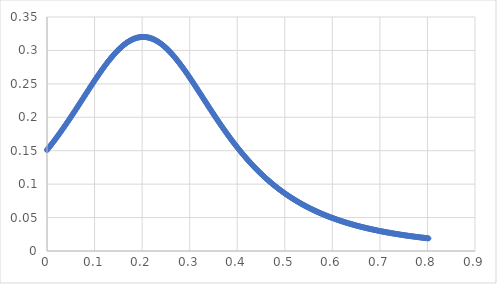
| Category | Series 0 |
|---|---|
| 2e-05 | 0.151 |
| 0.00202 | 0.153 |
| 0.004 | 0.155 |
| 0.00601 | 0.156 |
| 0.00803 | 0.158 |
| 0.01003 | 0.16 |
| 0.01201 | 0.162 |
| 0.01401 | 0.164 |
| 0.01602 | 0.166 |
| 0.01802 | 0.168 |
| 0.02 | 0.17 |
| 0.02201 | 0.171 |
| 0.02403 | 0.173 |
| 0.02603 | 0.175 |
| 0.02801 | 0.177 |
| 0.03001 | 0.179 |
| 0.03203 | 0.181 |
| 0.03404 | 0.183 |
| 0.03601 | 0.185 |
| 0.03801 | 0.188 |
| 0.04002 | 0.19 |
| 0.04203 | 0.192 |
| 0.044 | 0.194 |
| 0.046 | 0.196 |
| 0.04803 | 0.198 |
| 0.05004 | 0.2 |
| 0.05201 | 0.202 |
| 0.05401 | 0.204 |
| 0.05603 | 0.207 |
| 0.05804 | 0.209 |
| 0.06001 | 0.211 |
| 0.06201 | 0.213 |
| 0.06403 | 0.215 |
| 0.06603 | 0.218 |
| 0.068 | 0.22 |
| 0.07001 | 0.222 |
| 0.07203 | 0.224 |
| 0.07404 | 0.226 |
| 0.07601 | 0.229 |
| 0.07801 | 0.231 |
| 0.08003 | 0.233 |
| 0.08203 | 0.235 |
| 0.08401 | 0.237 |
| 0.08602 | 0.24 |
| 0.08803 | 0.242 |
| 0.09004 | 0.244 |
| 0.09201 | 0.246 |
| 0.09401 | 0.248 |
| 0.09603 | 0.25 |
| 0.09804 | 0.253 |
| 0.10002 | 0.255 |
| 0.10202 | 0.257 |
| 0.10403 | 0.259 |
| 0.10604 | 0.261 |
| 0.10802 | 0.263 |
| 0.11002 | 0.265 |
| 0.11203 | 0.267 |
| 0.11404 | 0.269 |
| 0.11601 | 0.271 |
| 0.11801 | 0.273 |
| 0.12003 | 0.275 |
| 0.12204 | 0.277 |
| 0.12402 | 0.279 |
| 0.12602 | 0.281 |
| 0.12804 | 0.283 |
| 0.13004 | 0.285 |
| 0.13202 | 0.286 |
| 0.13401 | 0.288 |
| 0.13603 | 0.29 |
| 0.13804 | 0.292 |
| 0.14001 | 0.293 |
| 0.14201 | 0.295 |
| 0.14402 | 0.296 |
| 0.14603 | 0.298 |
| 0.14801 | 0.299 |
| 0.15001 | 0.301 |
| 0.15203 | 0.302 |
| 0.15404 | 0.304 |
| 0.15602 | 0.305 |
| 0.15802 | 0.306 |
| 0.16004 | 0.307 |
| 0.16204 | 0.308 |
| 0.16401 | 0.31 |
| 0.16601 | 0.311 |
| 0.16802 | 0.312 |
| 0.17003 | 0.313 |
| 0.17201 | 0.313 |
| 0.17401 | 0.314 |
| 0.17603 | 0.315 |
| 0.17804 | 0.316 |
| 0.18002 | 0.317 |
| 0.18201 | 0.317 |
| 0.18403 | 0.318 |
| 0.18604 | 0.318 |
| 0.18802 | 0.319 |
| 0.19001 | 0.319 |
| 0.19202 | 0.319 |
| 0.19403 | 0.32 |
| 0.19601 | 0.32 |
| 0.198 | 0.32 |
| 0.20002 | 0.32 |
| 0.20204 | 0.32 |
| 0.20402 | 0.32 |
| 0.20601 | 0.32 |
| 0.20803 | 0.32 |
| 0.21004 | 0.32 |
| 0.21202 | 0.319 |
| 0.214 | 0.319 |
| 0.21602 | 0.319 |
| 0.21802 | 0.318 |
| 0.22 | 0.318 |
| 0.222 | 0.317 |
| 0.22402 | 0.317 |
| 0.22603 | 0.316 |
| 0.22801 | 0.315 |
| 0.23001 | 0.314 |
| 0.23202 | 0.314 |
| 0.23404 | 0.313 |
| 0.23602 | 0.312 |
| 0.23801 | 0.311 |
| 0.24002 | 0.31 |
| 0.24203 | 0.309 |
| 0.24401 | 0.308 |
| 0.246 | 0.306 |
| 0.24802 | 0.305 |
| 0.25003 | 0.304 |
| 0.25202 | 0.302 |
| 0.254 | 0.301 |
| 0.25602 | 0.3 |
| 0.25803 | 0.298 |
| 0.26001 | 0.297 |
| 0.262 | 0.295 |
| 0.26402 | 0.294 |
| 0.26603 | 0.292 |
| 0.26801 | 0.29 |
| 0.27 | 0.289 |
| 0.27202 | 0.287 |
| 0.27403 | 0.285 |
| 0.27601 | 0.283 |
| 0.27801 | 0.281 |
| 0.28002 | 0.279 |
| 0.28203 | 0.278 |
| 0.28401 | 0.276 |
| 0.286 | 0.274 |
| 0.28802 | 0.272 |
| 0.29003 | 0.27 |
| 0.29202 | 0.268 |
| 0.294 | 0.266 |
| 0.29602 | 0.264 |
| 0.29803 | 0.262 |
| 0.30001 | 0.259 |
| 0.302 | 0.257 |
| 0.30402 | 0.255 |
| 0.30603 | 0.253 |
| 0.30802 | 0.251 |
| 0.31 | 0.249 |
| 0.31202 | 0.247 |
| 0.31403 | 0.244 |
| 0.31601 | 0.242 |
| 0.318 | 0.24 |
| 0.32002 | 0.238 |
| 0.32202 | 0.236 |
| 0.32401 | 0.233 |
| 0.326 | 0.231 |
| 0.32802 | 0.229 |
| 0.33004 | 0.227 |
| 0.33201 | 0.225 |
| 0.334 | 0.222 |
| 0.33602 | 0.22 |
| 0.33803 | 0.218 |
| 0.34001 | 0.216 |
| 0.34201 | 0.214 |
| 0.34402 | 0.211 |
| 0.34602 | 0.209 |
| 0.34801 | 0.207 |
| 0.34999 | 0.205 |
| 0.35202 | 0.203 |
| 0.35403 | 0.201 |
| 0.35603 | 0.198 |
| 0.358 | 0.196 |
| 0.36002 | 0.194 |
| 0.36203 | 0.192 |
| 0.36402 | 0.19 |
| 0.366 | 0.188 |
| 0.36801 | 0.186 |
| 0.37003 | 0.184 |
| 0.37202 | 0.182 |
| 0.37399 | 0.18 |
| 0.37601 | 0.178 |
| 0.37803 | 0.176 |
| 0.38002 | 0.174 |
| 0.382 | 0.172 |
| 0.38402 | 0.17 |
| 0.38603 | 0.168 |
| 0.388 | 0.166 |
| 0.38999 | 0.164 |
| 0.39201 | 0.162 |
| 0.39402 | 0.161 |
| 0.39601 | 0.159 |
| 0.39799 | 0.157 |
| 0.4 | 0.155 |
| 0.40201 | 0.153 |
| 0.40401 | 0.152 |
| 0.40599 | 0.15 |
| 0.408 | 0.148 |
| 0.41001 | 0.146 |
| 0.41201 | 0.145 |
| 0.41398 | 0.143 |
| 0.416 | 0.141 |
| 0.41801 | 0.14 |
| 0.42 | 0.138 |
| 0.42198 | 0.136 |
| 0.42399 | 0.135 |
| 0.42601 | 0.133 |
| 0.42801 | 0.132 |
| 0.42998 | 0.13 |
| 0.432 | 0.129 |
| 0.43401 | 0.127 |
| 0.436 | 0.126 |
| 0.43798 | 0.124 |
| 0.44 | 0.123 |
| 0.44201 | 0.121 |
| 0.44401 | 0.12 |
| 0.44598 | 0.118 |
| 0.44799 | 0.117 |
| 0.45 | 0.116 |
| 0.452 | 0.114 |
| 0.45398 | 0.113 |
| 0.456 | 0.112 |
| 0.45801 | 0.11 |
| 0.46001 | 0.109 |
| 0.46199 | 0.108 |
| 0.464 | 0.106 |
| 0.46601 | 0.105 |
| 0.46801 | 0.104 |
| 0.46999 | 0.103 |
| 0.472 | 0.102 |
| 0.47401 | 0.1 |
| 0.476 | 0.099 |
| 0.47799 | 0.098 |
| 0.48 | 0.097 |
| 0.48201 | 0.096 |
| 0.48401 | 0.095 |
| 0.48599 | 0.094 |
| 0.488 | 0.092 |
| 0.49002 | 0.091 |
| 0.49201 | 0.09 |
| 0.49399 | 0.089 |
| 0.49601 | 0.088 |
| 0.49802 | 0.087 |
| 0.50001 | 0.086 |
| 0.502 | 0.085 |
| 0.504 | 0.084 |
| 0.50601 | 0.083 |
| 0.50801 | 0.082 |
| 0.50999 | 0.081 |
| 0.512 | 0.08 |
| 0.51402 | 0.08 |
| 0.51601 | 0.079 |
| 0.51799 | 0.078 |
| 0.52001 | 0.077 |
| 0.52203 | 0.076 |
| 0.52403 | 0.075 |
| 0.526 | 0.074 |
| 0.52801 | 0.073 |
| 0.53003 | 0.073 |
| 0.53203 | 0.072 |
| 0.534 | 0.071 |
| 0.53601 | 0.07 |
| 0.53802 | 0.069 |
| 0.54002 | 0.069 |
| 0.542 | 0.068 |
| 0.54401 | 0.067 |
| 0.54603 | 0.066 |
| 0.54803 | 0.066 |
| 0.55001 | 0.065 |
| 0.55201 | 0.064 |
| 0.55404 | 0.063 |
| 0.55604 | 0.063 |
| 0.558 | 0.062 |
| 0.56001 | 0.061 |
| 0.56202 | 0.061 |
| 0.56402 | 0.06 |
| 0.566 | 0.059 |
| 0.56801 | 0.059 |
| 0.57003 | 0.058 |
| 0.57203 | 0.057 |
| 0.57401 | 0.057 |
| 0.57602 | 0.056 |
| 0.57804 | 0.056 |
| 0.58003 | 0.055 |
| 0.58201 | 0.054 |
| 0.58402 | 0.054 |
| 0.58603 | 0.053 |
| 0.58803 | 0.053 |
| 0.59 | 0.052 |
| 0.59202 | 0.052 |
| 0.59404 | 0.051 |
| 0.59604 | 0.05 |
| 0.59801 | 0.05 |
| 0.60002 | 0.049 |
| 0.60203 | 0.049 |
| 0.60403 | 0.048 |
| 0.60602 | 0.048 |
| 0.60802 | 0.047 |
| 0.61003 | 0.047 |
| 0.61203 | 0.046 |
| 0.61401 | 0.046 |
| 0.61602 | 0.045 |
| 0.61804 | 0.045 |
| 0.62004 | 0.044 |
| 0.62202 | 0.044 |
| 0.62403 | 0.044 |
| 0.62604 | 0.043 |
| 0.62804 | 0.043 |
| 0.63001 | 0.042 |
| 0.63202 | 0.042 |
| 0.63403 | 0.041 |
| 0.63604 | 0.041 |
| 0.63801 | 0.041 |
| 0.64001 | 0.04 |
| 0.64202 | 0.04 |
| 0.64403 | 0.039 |
| 0.646 | 0.039 |
| 0.64801 | 0.039 |
| 0.65003 | 0.038 |
| 0.65203 | 0.038 |
| 0.654 | 0.037 |
| 0.65602 | 0.037 |
| 0.65803 | 0.037 |
| 0.66002 | 0.036 |
| 0.662 | 0.036 |
| 0.664 | 0.036 |
| 0.66602 | 0.035 |
| 0.66803 | 0.035 |
| 0.67 | 0.035 |
| 0.67201 | 0.034 |
| 0.67403 | 0.034 |
| 0.67603 | 0.034 |
| 0.678 | 0.033 |
| 0.68001 | 0.033 |
| 0.68203 | 0.033 |
| 0.68403 | 0.032 |
| 0.68601 | 0.032 |
| 0.68801 | 0.032 |
| 0.69003 | 0.031 |
| 0.69203 | 0.031 |
| 0.694 | 0.031 |
| 0.69601 | 0.03 |
| 0.69803 | 0.03 |
| 0.70004 | 0.03 |
| 0.70201 | 0.03 |
| 0.70402 | 0.029 |
| 0.70603 | 0.029 |
| 0.70803 | 0.029 |
| 0.71 | 0.029 |
| 0.71201 | 0.028 |
| 0.71403 | 0.028 |
| 0.71603 | 0.028 |
| 0.71801 | 0.027 |
| 0.72001 | 0.027 |
| 0.72203 | 0.027 |
| 0.72404 | 0.027 |
| 0.72601 | 0.026 |
| 0.72801 | 0.026 |
| 0.73003 | 0.026 |
| 0.73204 | 0.026 |
| 0.73401 | 0.026 |
| 0.73601 | 0.025 |
| 0.73803 | 0.025 |
| 0.74003 | 0.025 |
| 0.74201 | 0.025 |
| 0.74401 | 0.024 |
| 0.74603 | 0.024 |
| 0.74804 | 0.024 |
| 0.75002 | 0.024 |
| 0.75202 | 0.024 |
| 0.75403 | 0.023 |
| 0.75604 | 0.023 |
| 0.75801 | 0.023 |
| 0.76001 | 0.023 |
| 0.76203 | 0.022 |
| 0.76404 | 0.022 |
| 0.766 | 0.022 |
| 0.76801 | 0.022 |
| 0.77003 | 0.022 |
| 0.77204 | 0.022 |
| 0.77402 | 0.021 |
| 0.77601 | 0.021 |
| 0.77803 | 0.021 |
| 0.78004 | 0.021 |
| 0.78202 | 0.021 |
| 0.78402 | 0.02 |
| 0.78603 | 0.02 |
| 0.78804 | 0.02 |
| 0.79001 | 0.02 |
| 0.79201 | 0.02 |
| 0.79403 | 0.02 |
| 0.79604 | 0.019 |
| 0.79802 | 0.019 |
| 0.80001 | 0.019 |
| 0.80203 | 0.019 |